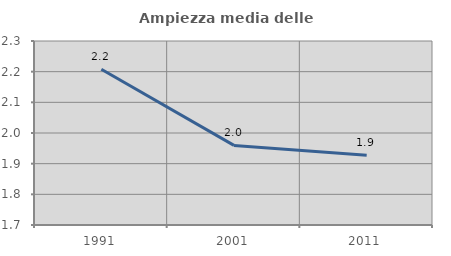
| Category | Ampiezza media delle famiglie |
|---|---|
| 1991.0 | 2.208 |
| 2001.0 | 1.96 |
| 2011.0 | 1.928 |